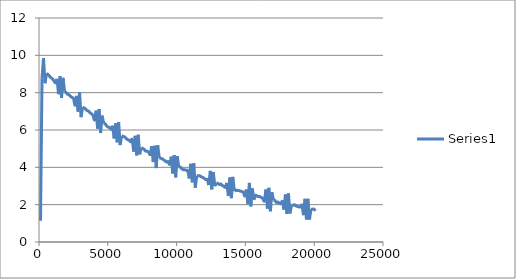
| Category | Series 0 |
|---|---|
| 109.0 | 1.144 |
| 219.0 | 8.768 |
| 328.0 | 9.853 |
| 437.0 | 8.504 |
| 546.0 | 9.032 |
| 655.0 | 8.974 |
| 765.0 | 8.886 |
| 874.0 | 8.798 |
| 983.0 | 8.739 |
| 1092.0 | 8.622 |
| 1201.0 | 8.534 |
| 1311.0 | 8.739 |
| 1420.0 | 7.918 |
| 1529.0 | 8.886 |
| 1638.0 | 7.713 |
| 1747.0 | 8.798 |
| 1857.0 | 8.065 |
| 1966.0 | 8.006 |
| 2075.0 | 7.918 |
| 2184.0 | 7.889 |
| 2293.0 | 7.801 |
| 2403.0 | 7.742 |
| 2512.0 | 7.683 |
| 2621.0 | 7.331 |
| 2730.0 | 7.83 |
| 2839.0 | 6.979 |
| 2949.0 | 8.006 |
| 3058.0 | 6.686 |
| 3167.0 | 7.214 |
| 3276.0 | 7.185 |
| 3385.0 | 7.126 |
| 3495.0 | 7.038 |
| 3604.0 | 7.009 |
| 3713.0 | 6.921 |
| 3822.0 | 6.862 |
| 3931.0 | 6.774 |
| 4041.0 | 6.54 |
| 4150.0 | 7.038 |
| 4259.0 | 6.07 |
| 4368.0 | 7.126 |
| 4477.0 | 5.836 |
| 4587.0 | 6.774 |
| 4696.0 | 6.364 |
| 4805.0 | 6.334 |
| 4914.0 | 6.217 |
| 5023.0 | 6.158 |
| 5133.0 | 6.129 |
| 5242.0 | 6.041 |
| 5351.0 | 6.158 |
| 5460.0 | 5.543 |
| 5570.0 | 6.364 |
| 5679.0 | 5.337 |
| 5788.0 | 6.422 |
| 5897.0 | 5.191 |
| 6006.0 | 5.689 |
| 6116.0 | 5.66 |
| 6225.0 | 5.63 |
| 6334.0 | 5.543 |
| 6443.0 | 5.484 |
| 6552.0 | 5.455 |
| 6662.0 | 5.367 |
| 6771.0 | 5.484 |
| 6880.0 | 4.839 |
| 6989.0 | 5.689 |
| 7098.0 | 4.633 |
| 7208.0 | 5.748 |
| 7317.0 | 4.692 |
| 7426.0 | 5.044 |
| 7535.0 | 5.015 |
| 7644.0 | 4.956 |
| 7754.0 | 4.868 |
| 7863.0 | 4.868 |
| 7972.0 | 4.809 |
| 8081.0 | 4.692 |
| 8190.0 | 5.132 |
| 8300.0 | 4.282 |
| 8409.0 | 5.161 |
| 8518.0 | 3.959 |
| 8627.0 | 5.191 |
| 8736.0 | 4.516 |
| 8846.0 | 4.487 |
| 8955.0 | 4.457 |
| 9064.0 | 4.399 |
| 9173.0 | 4.34 |
| 9282.0 | 4.282 |
| 9392.0 | 4.311 |
| 9501.0 | 4.164 |
| 9610.0 | 4.575 |
| 9719.0 | 3.666 |
| 9828.0 | 4.663 |
| 9938.0 | 3.46 |
| 10047.0 | 4.604 |
| 10156.0 | 4.018 |
| 10265.0 | 4.018 |
| 10374.0 | 3.93 |
| 10484.0 | 3.871 |
| 10593.0 | 3.871 |
| 10702.0 | 3.842 |
| 10811.0 | 3.812 |
| 10920.0 | 3.402 |
| 11030.0 | 4.194 |
| 11139.0 | 3.196 |
| 11248.0 | 4.223 |
| 11357.0 | 2.903 |
| 11466.0 | 3.548 |
| 11576.0 | 3.548 |
| 11685.0 | 3.548 |
| 11794.0 | 3.49 |
| 11903.0 | 3.46 |
| 12012.0 | 3.402 |
| 12122.0 | 3.343 |
| 12231.0 | 3.343 |
| 12340.0 | 3.05 |
| 12449.0 | 3.812 |
| 12558.0 | 2.815 |
| 12668.0 | 3.754 |
| 12777.0 | 2.991 |
| 12886.0 | 3.167 |
| 12995.0 | 3.138 |
| 13104.0 | 3.079 |
| 13214.0 | 3.108 |
| 13323.0 | 3.021 |
| 13432.0 | 2.991 |
| 13541.0 | 2.933 |
| 13650.0 | 3.167 |
| 13760.0 | 2.463 |
| 13869.0 | 3.46 |
| 13978.0 | 2.346 |
| 14087.0 | 3.49 |
| 14196.0 | 2.727 |
| 14306.0 | 2.786 |
| 14415.0 | 2.757 |
| 14524.0 | 2.757 |
| 14633.0 | 2.727 |
| 14742.0 | 2.698 |
| 14852.0 | 2.669 |
| 14961.0 | 2.463 |
| 15070.0 | 2.815 |
| 15179.0 | 2.023 |
| 15288.0 | 3.167 |
| 15398.0 | 1.906 |
| 15507.0 | 2.874 |
| 15616.0 | 2.258 |
| 15725.0 | 2.493 |
| 15834.0 | 2.463 |
| 15944.0 | 2.434 |
| 16053.0 | 2.434 |
| 16162.0 | 2.375 |
| 16271.0 | 2.346 |
| 16380.0 | 2.199 |
| 16490.0 | 2.815 |
| 16599.0 | 1.789 |
| 16708.0 | 2.903 |
| 16817.0 | 1.642 |
| 16926.0 | 2.669 |
| 17036.0 | 2.258 |
| 17145.0 | 2.229 |
| 17254.0 | 2.111 |
| 17363.0 | 2.141 |
| 17472.0 | 2.082 |
| 17582.0 | 2.053 |
| 17691.0 | 2.17 |
| 17800.0 | 1.73 |
| 17909.0 | 2.551 |
| 18018.0 | 1.496 |
| 18128.0 | 2.61 |
| 18237.0 | 1.525 |
| 18346.0 | 1.965 |
| 18455.0 | 1.965 |
| 18564.0 | 1.994 |
| 18674.0 | 1.935 |
| 18783.0 | 1.906 |
| 18892.0 | 1.877 |
| 19001.0 | 1.877 |
| 19110.0 | 1.965 |
| 19220.0 | 1.437 |
| 19329.0 | 2.317 |
| 19438.0 | 1.202 |
| 19547.0 | 2.317 |
| 19656.0 | 1.202 |
| 19766.0 | 1.76 |
| 19875.0 | 1.76 |
| 19984.0 | 1.76 |
| 20093.0 | 1.672 |